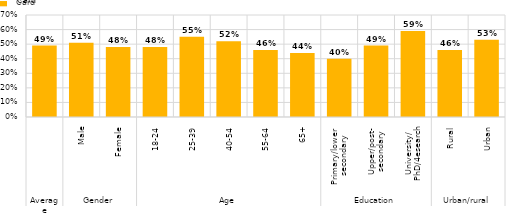
| Category | Series 0 |
|---|---|
| 0 | 0.49 |
| 1 | 0.51 |
| 2 | 0.48 |
| 3 | 0.48 |
| 4 | 0.55 |
| 5 | 0.52 |
| 6 | 0.46 |
| 7 | 0.44 |
| 8 | 0.4 |
| 9 | 0.49 |
| 10 | 0.59 |
| 11 | 0.46 |
| 12 | 0.53 |